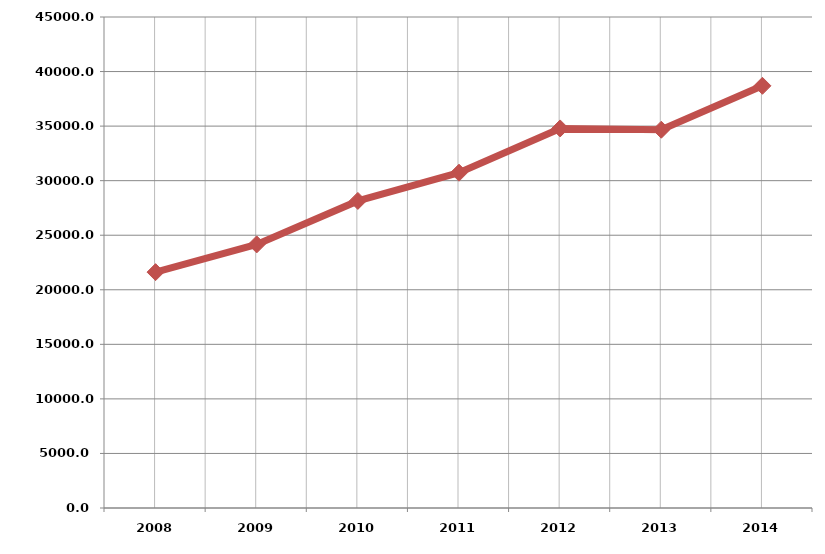
| Category | الطاقة المولــــدة
 [جبجا واط . ساعة) Generation (GWH) |
|---|---|
| 2008.0 | 21616 |
| 2009.0 | 24158 |
| 2010.0 | 28144 |
| 2011.0 | 30731 |
| 2012.0 | 34788 |
| 2013.0 | 34668 |
| 2014.0 | 38693 |